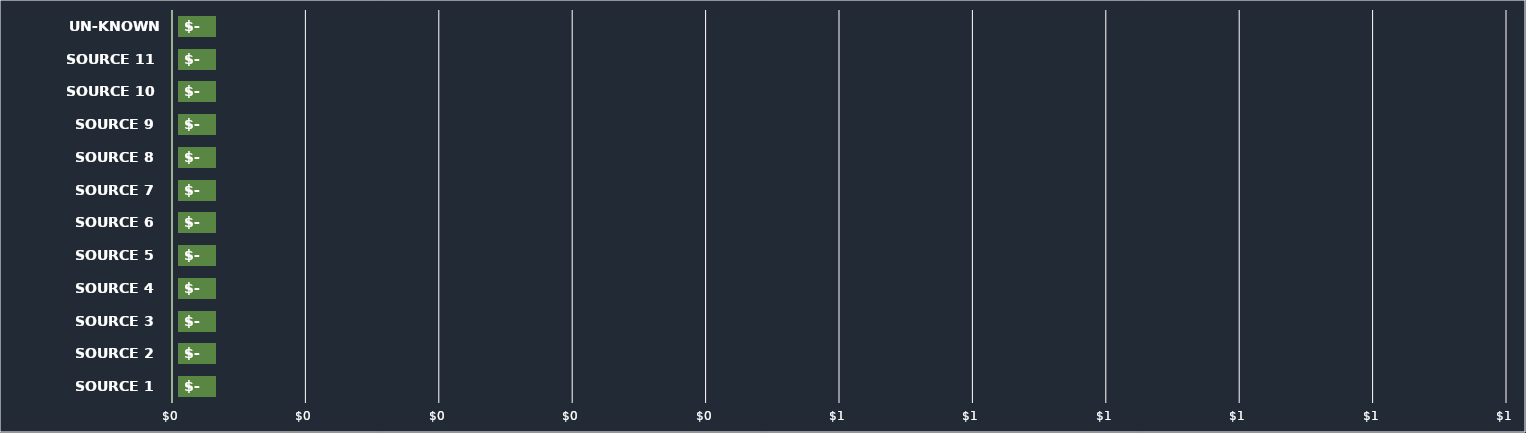
| Category | Series 0 |
|---|---|
| SOURCE 1 | 0 |
| SOURCE 2 | 0 |
| SOURCE 3 | 0 |
| SOURCE 4 | 0 |
| SOURCE 5 | 0 |
| SOURCE 6 | 0 |
| SOURCE 7 | 0 |
| SOURCE 8 | 0 |
| SOURCE 9 | 0 |
| SOURCE 10 | 0 |
| SOURCE 11 | 0 |
| UN-KNOWN SOURCE | 0 |